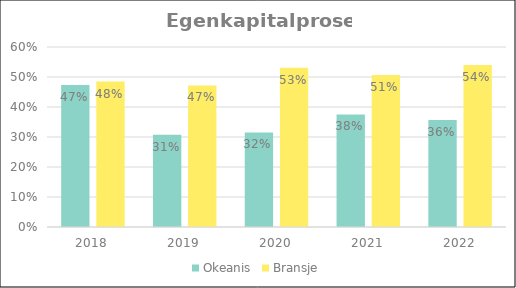
| Category | Okeanis | Bransje |
|---|---|---|
| 2018 | 0.473 | 0.485 |
| 2019 | 0.308 | 0.472 |
| 2020 | 0.315 | 0.531 |
| 2021 | 0.375 | 0.506 |
| 2022 | 0.357 | 0.54 |